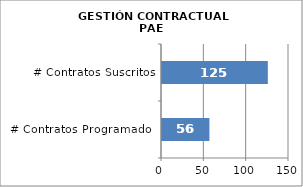
| Category | Series 0 |
|---|---|
| # Contratos Programados | 56 |
| # Contratos Suscritos | 125 |